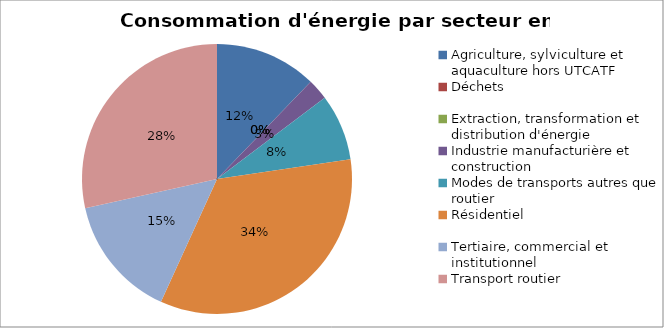
| Category | Series 0 |
|---|---|
| Agriculture, sylviculture et aquaculture hors UTCATF | 26167.943 |
| Déchets | 0 |
| Extraction, transformation et distribution d'énergie | 0 |
| Industrie manufacturière et construction | 5352.552 |
| Modes de transports autres que routier | 17056.781 |
| Résidentiel | 73172.809 |
| Tertiaire, commercial et institutionnel | 31525.89 |
| Transport routier | 61027.933 |